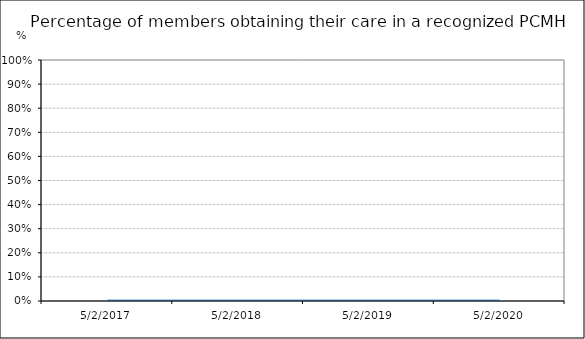
| Category | % | Date / Observation |
|---|---|---|
| 5/2/17 | 0 | 5/2/17 |
| 5/2/18 | 0 | 5/2/18 |
| 5/2/19 | 0 | 5/2/19 |
| 5/2/20 | 0 | 5/2/20 |